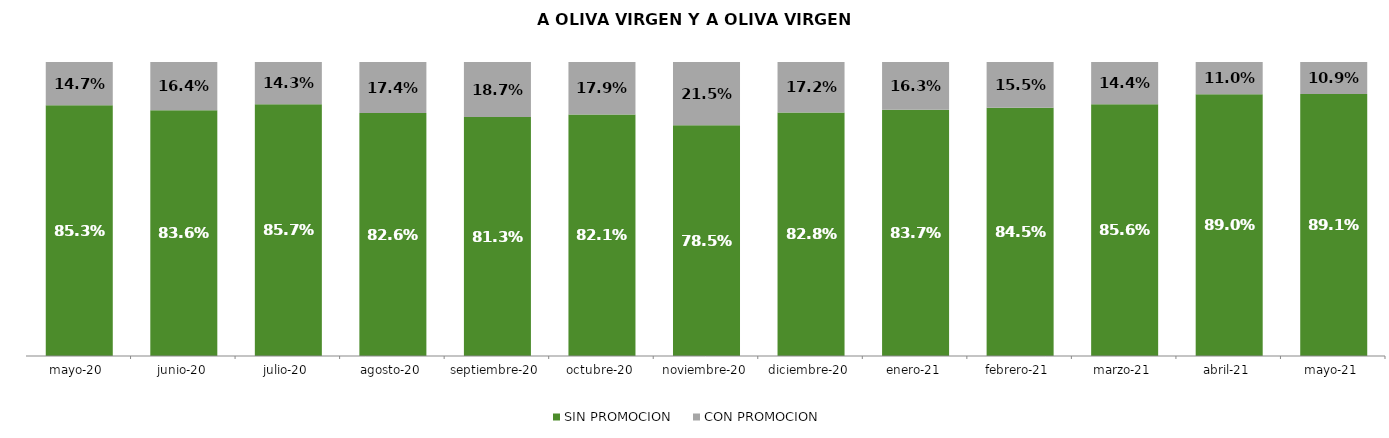
| Category | SIN PROMOCION   | CON PROMOCION   |
|---|---|---|
| 2020-05-01 | 0.853 | 0.147 |
| 2020-06-01 | 0.836 | 0.164 |
| 2020-07-01 | 0.857 | 0.143 |
| 2020-08-01 | 0.826 | 0.174 |
| 2020-09-01 | 0.813 | 0.187 |
| 2020-10-01 | 0.821 | 0.179 |
| 2020-11-01 | 0.785 | 0.215 |
| 2020-12-01 | 0.828 | 0.172 |
| 2021-01-01 | 0.837 | 0.163 |
| 2021-02-01 | 0.845 | 0.155 |
| 2021-03-01 | 0.856 | 0.144 |
| 2021-04-01 | 0.89 | 0.11 |
| 2021-05-01 | 0.891 | 0.109 |